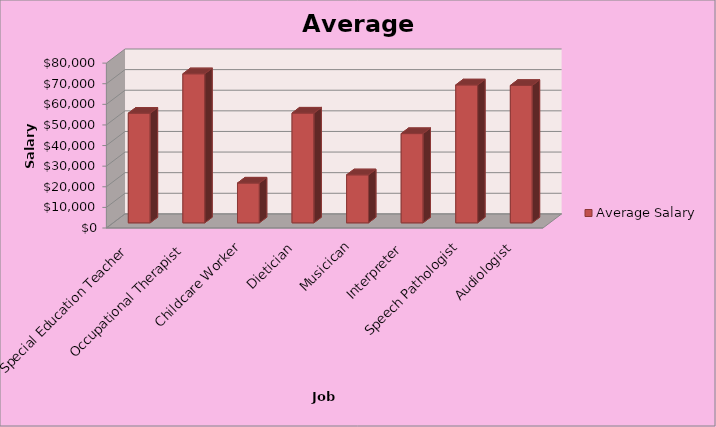
| Category | Average Salary |
|---|---|
| Special Education Teacher | 53200 |
| Occupational Therapist | 72320 |
| Childcare Worker | 19300 |
| Dietician | 53250 |
| Musicican | 23285 |
| Interpreter | 43300 |
| Speech Pathologist | 66920 |
| Audiologist | 66660 |